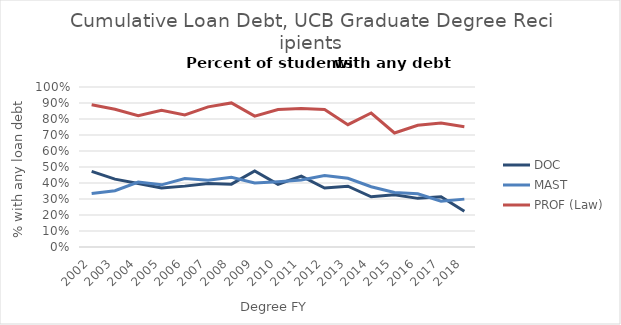
| Category | DOC | MAST | PROF (Law) |
|---|---|---|---|
| 2002.0 | 0.472 | 0.334 | 0.889 |
| 2003.0 | 0.424 | 0.352 | 0.861 |
| 2004.0 | 0.396 | 0.406 | 0.821 |
| 2005.0 | 0.368 | 0.389 | 0.855 |
| 2006.0 | 0.38 | 0.428 | 0.825 |
| 2007.0 | 0.397 | 0.417 | 0.876 |
| 2008.0 | 0.393 | 0.436 | 0.901 |
| 2009.0 | 0.475 | 0.4 | 0.818 |
| 2010.0 | 0.392 | 0.408 | 0.859 |
| 2011.0 | 0.443 | 0.419 | 0.866 |
| 2012.0 | 0.368 | 0.447 | 0.859 |
| 2013.0 | 0.38 | 0.429 | 0.764 |
| 2014.0 | 0.314 | 0.376 | 0.837 |
| 2015.0 | 0.327 | 0.341 | 0.712 |
| 2016.0 | 0.304 | 0.333 | 0.761 |
| 2017.0 | 0.314 | 0.286 | 0.775 |
| 2018.0 | 0.223 | 0.299 | 0.751 |